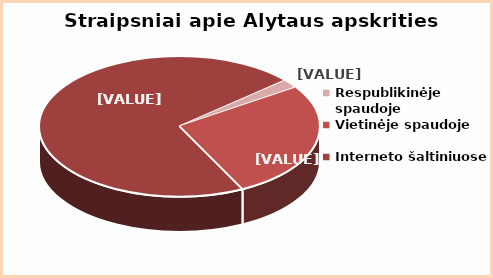
| Category | Series 0 |
|---|---|
| Respublikinėje spaudoje | 2 |
| Vietinėje spaudoje | 27 |
| Interneto šaltiniuose | 71 |